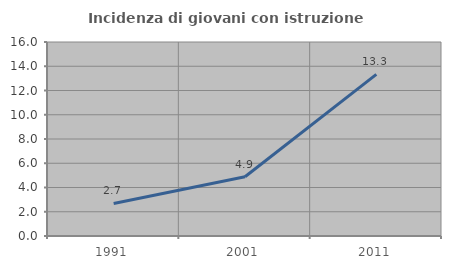
| Category | Incidenza di giovani con istruzione universitaria |
|---|---|
| 1991.0 | 2.685 |
| 2001.0 | 4.883 |
| 2011.0 | 13.333 |